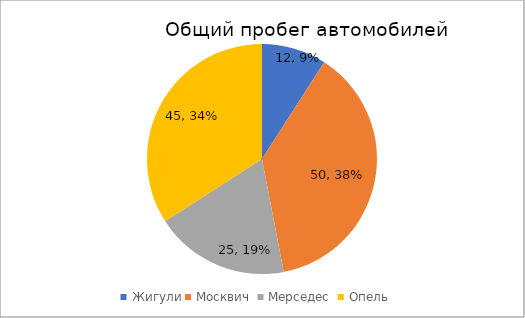
| Category | Series 1 | Series 0 |
|---|---|---|
| Жигули | 12 | 12 |
| Москвич  | 50 | 50 |
| Мерседес  | 25 | 25 |
| Опель  | 45 | 45 |